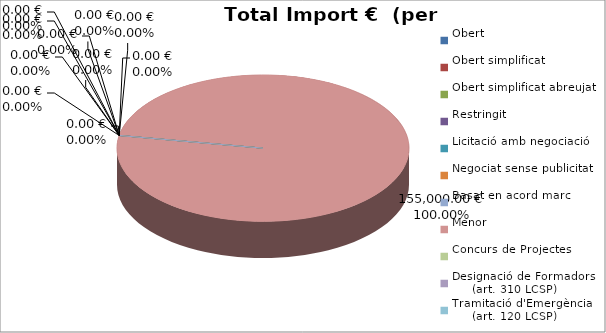
| Category | Total preu
(amb IVA) |
|---|---|
| Obert | 0 |
| Obert simplificat | 0 |
| Obert simplificat abreujat | 0 |
| Restringit | 0 |
| Licitació amb negociació | 0 |
| Negociat sense publicitat | 0 |
| Basat en acord marc | 0 |
| Menor | 155000 |
| Concurs de Projectes | 0 |
| Designació de Formadors
     (art. 310 LCSP) | 0 |
| Tramitació d'Emergència
     (art. 120 LCSP) | 0 |